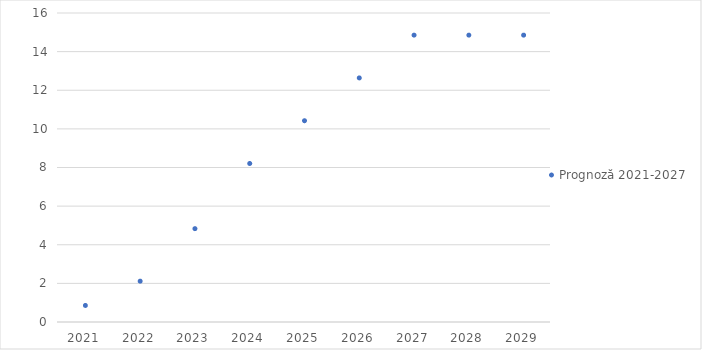
| Category | Prognoză 2021-2027 |
|---|---|
| 2021.0 | 0.856 |
| 2022.0 | 2.115 |
| 2023.0 | 4.834 |
| 2024.0 | 8.207 |
| 2025.0 | 10.423 |
| 2026.0 | 12.638 |
| 2027.0 | 14.854 |
| 2028.0 | 14.854 |
| 2029.0 | 14.854 |